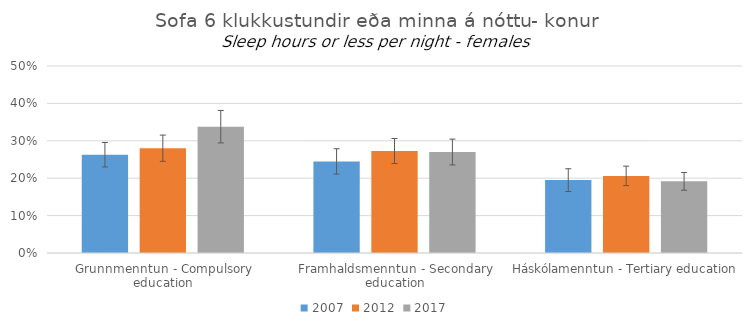
| Category | 2007 | 2012 | 2017 |
|---|---|---|---|
| Grunnmenntun - Compulsory education | 0.263 | 0.28 | 0.338 |
| Framhaldsmenntun - Secondary education | 0.245 | 0.273 | 0.27 |
| Háskólamenntun - Tertiary education | 0.195 | 0.206 | 0.192 |